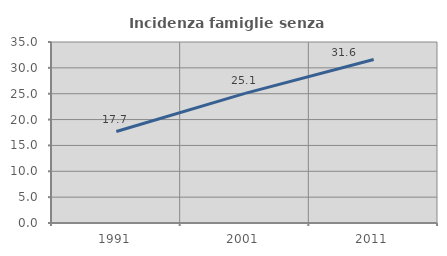
| Category | Incidenza famiglie senza nuclei |
|---|---|
| 1991.0 | 17.682 |
| 2001.0 | 25.058 |
| 2011.0 | 31.62 |